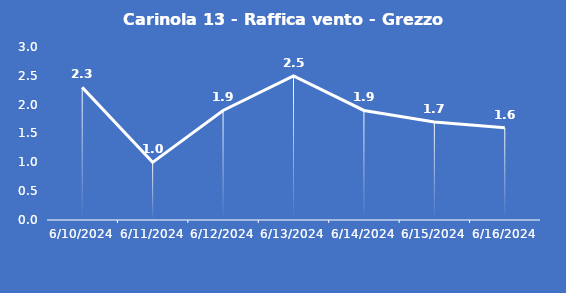
| Category | Carinola 13 - Raffica vento - Grezzo (m/s) |
|---|---|
| 6/10/24 | 2.3 |
| 6/11/24 | 1 |
| 6/12/24 | 1.9 |
| 6/13/24 | 2.5 |
| 6/14/24 | 1.9 |
| 6/15/24 | 1.7 |
| 6/16/24 | 1.6 |